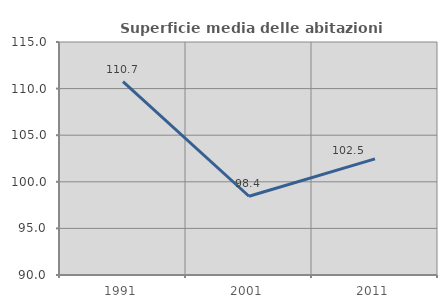
| Category | Superficie media delle abitazioni occupate |
|---|---|
| 1991.0 | 110.75 |
| 2001.0 | 98.449 |
| 2011.0 | 102.461 |